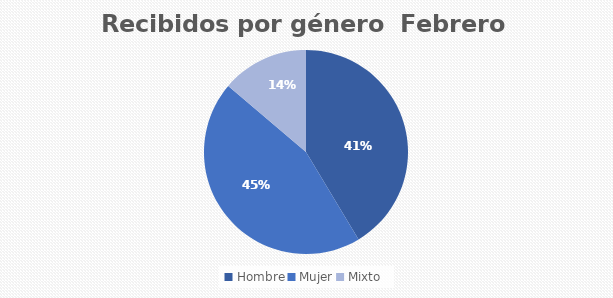
| Category | Recibidos por género  FEBRERO |
|---|---|
| Hombre | 12 |
| Mujer | 13 |
| Mixto | 4 |